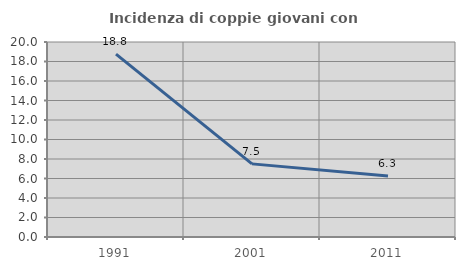
| Category | Incidenza di coppie giovani con figli |
|---|---|
| 1991.0 | 18.75 |
| 2001.0 | 7.5 |
| 2011.0 | 6.25 |